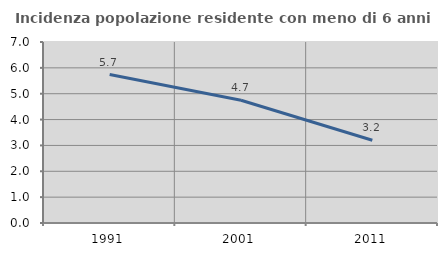
| Category | Incidenza popolazione residente con meno di 6 anni |
|---|---|
| 1991.0 | 5.74 |
| 2001.0 | 4.747 |
| 2011.0 | 3.2 |